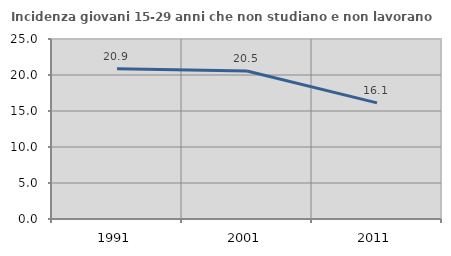
| Category | Incidenza giovani 15-29 anni che non studiano e non lavorano  |
|---|---|
| 1991.0 | 20.87 |
| 2001.0 | 20.548 |
| 2011.0 | 16.129 |